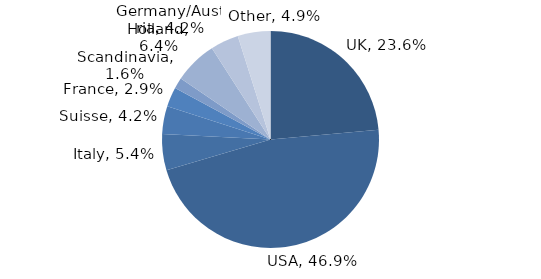
| Category | Investment Style |
|---|---|
| UK | 0.236 |
| USA | 0.469 |
| Italy | 0.054 |
| Suisse | 0.042 |
| France | 0.029 |
| Scandinavia | 0.016 |
| Holland | 0.064 |
| Germany/Austria | 0.042 |
| Other | 0.049 |